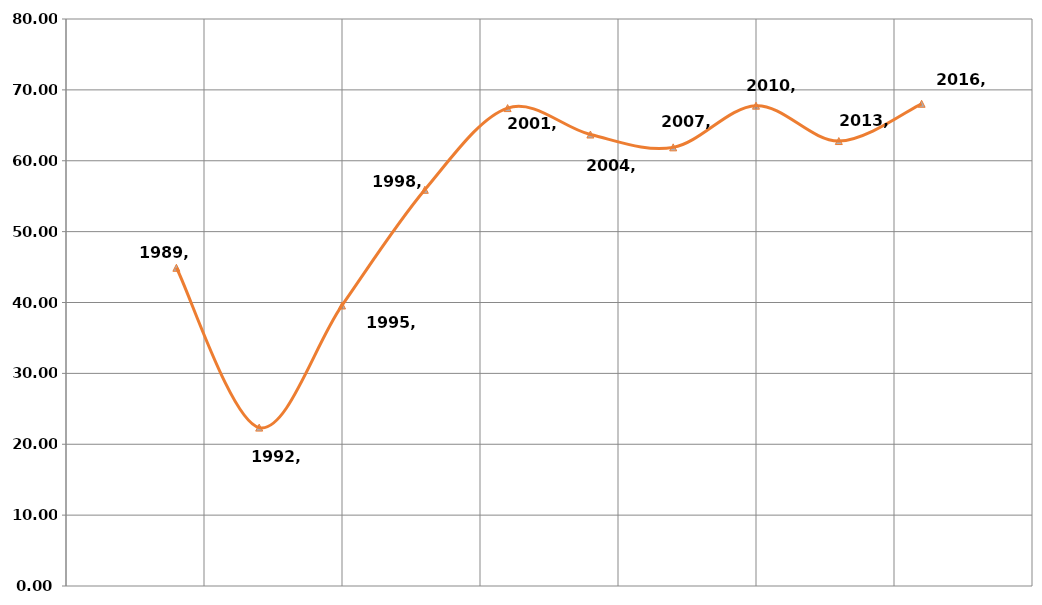
| Category | Municipes |
|---|---|
| 1989.0 | 44.9 |
| 1992.0 | 22.35 |
| 1995.0 | 39.58 |
| 1998.0 | 55.9 |
| 2001.0 | 67.43 |
| 2004.0 | 63.7 |
| 2007.0 | 61.89 |
| 2010.0 | 67.77 |
| 2013.0 | 62.78 |
| 2016.0 | 68.04 |